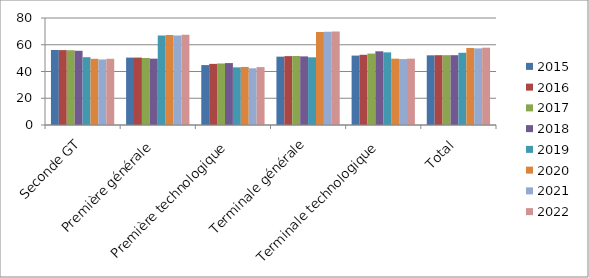
| Category | 2015 | 2016 | 2017 | 2018 | 2019 | 2020 | 2021 | 2022 |
|---|---|---|---|---|---|---|---|---|
| Seconde GT | 56.1 | 56 | 55.9 | 55.5 | 50.7 | 49.5 | 49 | 49.5 |
| Première générale | 50.4 | 50.4 | 50.1 | 49.6 | 67 | 67.2 | 66.9 | 67.4 |
| Première technologique | 44.8 | 45.7 | 46 | 46.3 | 43.1 | 43.4 | 42.4 | 43.3 |
| Terminale générale | 51.1 | 51.5 | 51.6 | 51.3 | 50.6 | 69.5 | 69.8 | 70 |
| Terminale technologique | 51.9 | 52.5 | 53.4 | 55.1 | 54.3 | 49.6 | 49.3 | 49.6 |
| Total | 52.1 | 52.2 | 52.2 | 52.2 | 54 | 57.6 | 57.3 | 57.8 |